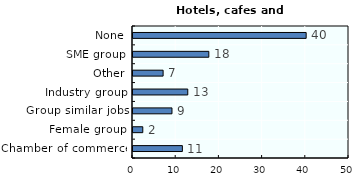
| Category | Hotels, cafes and restaurants |
|---|---|
| Chamber of commerce | 11.431 |
| Female group | 2.264 |
| Group similar jobs | 9.022 |
| Industry group | 12.678 |
| Other | 6.972 |
| SME group | 17.549 |
| None | 40.084 |